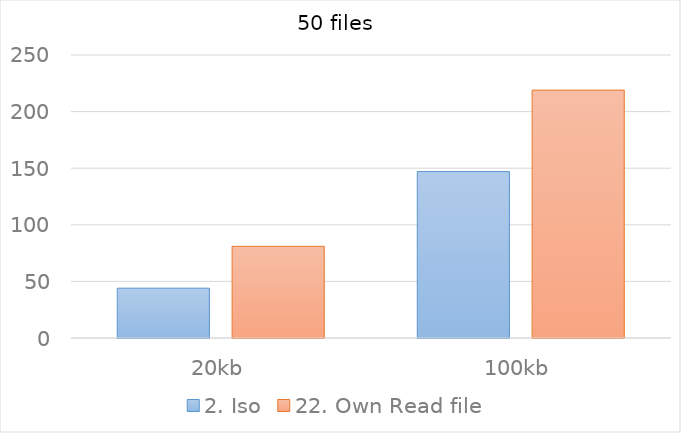
| Category | 2. Iso | 22. Own Read file |
|---|---|---|
| 20kb | 44 | 81 |
| 100kb | 147 | 219 |